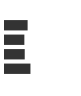
| Category | Series 0 |
|---|---|
| 0 | 0.314 |
| 1 | 0.269 |
| 2 | 0.274 |
| 3 | 0.354 |